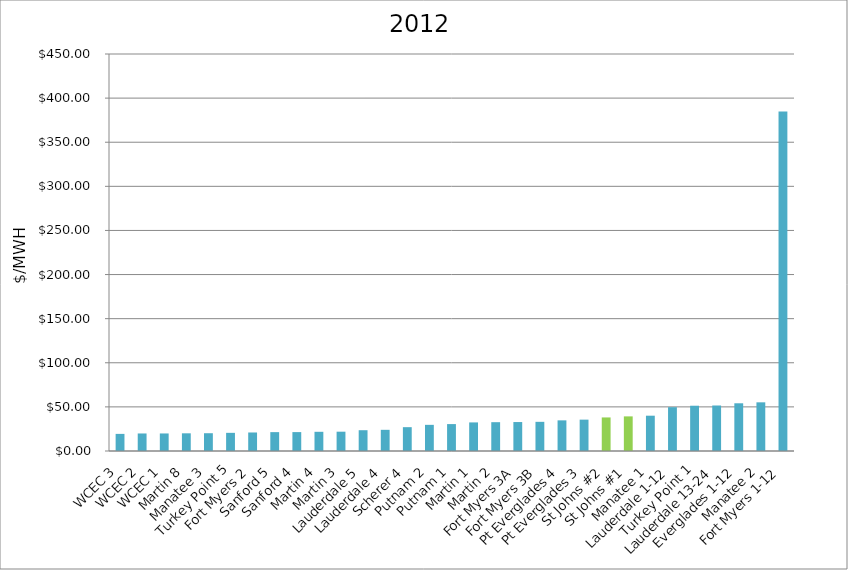
| Category | $/MWH |
|---|---|
| WCEC 3 | 19.397 |
| WCEC 2 | 19.872 |
| WCEC 1 | 19.885 |
| Martin 8 | 20.05 |
| Manatee 3 | 20.154 |
| Turkey Point 5 | 20.582 |
| Fort Myers 2 | 20.992 |
| Sanford 5 | 21.393 |
| Sanford 4 | 21.426 |
| Martin 4 | 21.767 |
| Martin 3 | 21.884 |
| Lauderdale 5 | 23.565 |
| Lauderdale 4 | 24.007 |
| Scherer 4 | 27.017 |
| Putnam 2 | 29.645 |
| Putnam 1 | 30.508 |
| Martin 1 | 32.402 |
| Martin 2 | 32.664 |
| Fort Myers 3A | 32.826 |
| Fort Myers 3B | 33.063 |
| Pt Everglades 4 | 34.735 |
| Pt Everglades 3 | 35.546 |
| St Johns #2 | 38.043 |
| St Johns #1 | 39.241 |
| Manatee 1 | 40.018 |
| Lauderdale 1-12 | 49.671 |
| Turkey Point 1 | 51.314 |
| Lauderdale 13-24 | 51.574 |
| Everglades 1-12 | 54.091 |
| Manatee 2 | 55.173 |
| Fort Myers 1-12 | 384.956 |